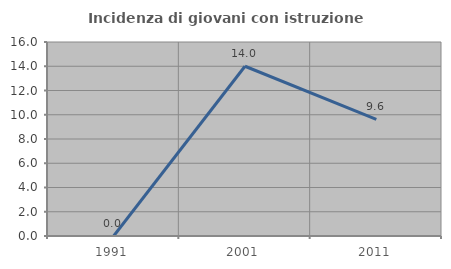
| Category | Incidenza di giovani con istruzione universitaria |
|---|---|
| 1991.0 | 0 |
| 2001.0 | 14 |
| 2011.0 | 9.615 |